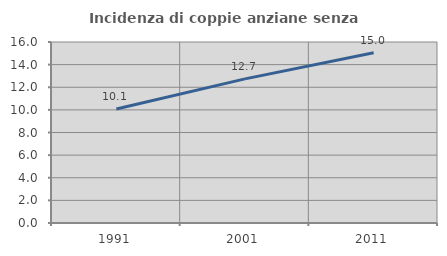
| Category | Incidenza di coppie anziane senza figli  |
|---|---|
| 1991.0 | 10.074 |
| 2001.0 | 12.74 |
| 2011.0 | 15.041 |